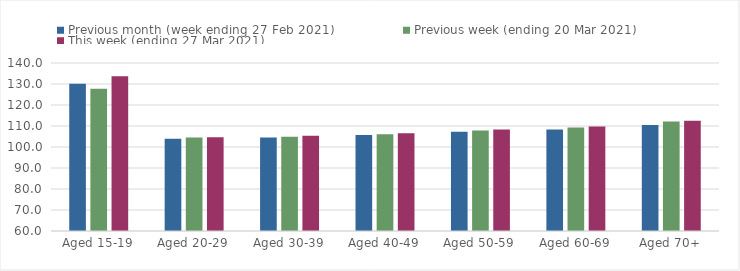
| Category | Previous month (week ending 27 Feb 2021) | Previous week (ending 20 Mar 2021) | This week (ending 27 Mar 2021) |
|---|---|---|---|
| Aged 15-19 | 130.06 | 127.76 | 133.72 |
| Aged 20-29 | 103.94 | 104.51 | 104.61 |
| Aged 30-39 | 104.47 | 104.88 | 105.35 |
| Aged 40-49 | 105.73 | 106.1 | 106.59 |
| Aged 50-59 | 107.23 | 107.8 | 108.31 |
| Aged 60-69 | 108.28 | 109.33 | 109.78 |
| Aged 70+ | 110.48 | 112.09 | 112.52 |